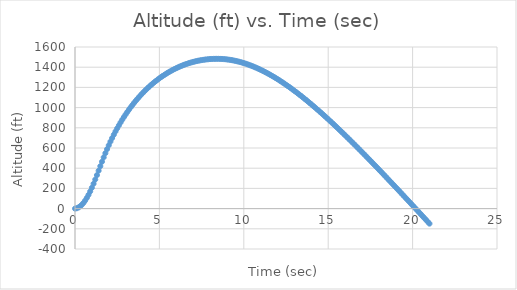
| Category | Series 0 |
|---|---|
| 0.0 | 0 |
| 0.1 | 3.427 |
| 0.2 | 10.56 |
| 0.30000000000000004 | 21.672 |
| 0.4 | 36.799 |
| 0.5 | 55.93 |
| 0.6 | 79.007 |
| 0.7 | 105.843 |
| 0.7999999999999999 | 136.231 |
| 0.8999999999999999 | 169.945 |
| 0.9999999999999999 | 206.744 |
| 1.0999999999999999 | 246.239 |
| 1.2 | 288.037 |
| 1.3 | 331.465 |
| 1.4000000000000001 | 375.577 |
| 1.5000000000000002 | 420.05 |
| 1.6000000000000003 | 464.271 |
| 1.7000000000000004 | 507.351 |
| 1.8000000000000005 | 548.898 |
| 1.9000000000000006 | 588.853 |
| 2.0000000000000004 | 627.005 |
| 2.1000000000000005 | 663.486 |
| 2.2000000000000006 | 698.412 |
| 2.3000000000000007 | 731.887 |
| 2.400000000000001 | 764.004 |
| 2.500000000000001 | 794.847 |
| 2.600000000000001 | 824.489 |
| 2.700000000000001 | 852.998 |
| 2.800000000000001 | 880.437 |
| 2.9000000000000012 | 906.859 |
| 3.0000000000000013 | 932.317 |
| 3.1000000000000014 | 956.856 |
| 3.2000000000000015 | 980.52 |
| 3.3000000000000016 | 1003.346 |
| 3.4000000000000017 | 1025.372 |
| 3.5000000000000018 | 1046.63 |
| 3.600000000000002 | 1067.151 |
| 3.700000000000002 | 1086.963 |
| 3.800000000000002 | 1106.093 |
| 3.900000000000002 | 1124.566 |
| 4.000000000000002 | 1142.403 |
| 4.100000000000001 | 1159.627 |
| 4.200000000000001 | 1176.257 |
| 4.300000000000001 | 1192.311 |
| 4.4 | 1207.807 |
| 4.5 | 1222.761 |
| 4.6 | 1237.188 |
| 4.699999999999999 | 1251.102 |
| 4.799999999999999 | 1264.517 |
| 4.899999999999999 | 1277.445 |
| 4.999999999999998 | 1289.898 |
| 5.099999999999998 | 1301.887 |
| 5.1999999999999975 | 1313.422 |
| 5.299999999999997 | 1324.513 |
| 5.399999999999997 | 1335.169 |
| 5.4999999999999964 | 1345.4 |
| 5.599999999999996 | 1355.213 |
| 5.699999999999996 | 1364.615 |
| 5.799999999999995 | 1373.615 |
| 5.899999999999995 | 1382.219 |
| 5.999999999999995 | 1390.433 |
| 6.099999999999994 | 1398.263 |
| 6.199999999999994 | 1405.716 |
| 6.299999999999994 | 1412.797 |
| 6.399999999999993 | 1419.51 |
| 6.499999999999993 | 1425.861 |
| 6.5999999999999925 | 1431.854 |
| 6.699999999999992 | 1437.494 |
| 6.799999999999992 | 1442.784 |
| 6.8999999999999915 | 1447.729 |
| 6.999999999999991 | 1452.332 |
| 7.099999999999991 | 1456.598 |
| 7.19999999999999 | 1460.529 |
| 7.29999999999999 | 1464.129 |
| 7.39999999999999 | 1467.402 |
| 7.499999999999989 | 1470.351 |
| 7.599999999999989 | 1472.981 |
| 7.699999999999989 | 1475.295 |
| 7.799999999999988 | 1477.298 |
| 7.899999999999988 | 1478.993 |
| 7.999999999999988 | 1480.386 |
| 8.099999999999987 | 1481.479 |
| 8.199999999999987 | 1482.274 |
| 8.299999999999986 | 1482.768 |
| 8.399999999999986 | 1482.953 |
| 8.499999999999986 | 1482.816 |
| 8.599999999999985 | 1482.345 |
| 8.699999999999985 | 1481.53 |
| 8.799999999999985 | 1480.367 |
| 8.899999999999984 | 1478.858 |
| 8.999999999999984 | 1477.006 |
| 9.099999999999984 | 1474.816 |
| 9.199999999999983 | 1472.293 |
| 9.299999999999983 | 1469.441 |
| 9.399999999999983 | 1466.266 |
| 9.499999999999982 | 1462.77 |
| 9.599999999999982 | 1458.958 |
| 9.699999999999982 | 1454.833 |
| 9.799999999999981 | 1450.397 |
| 9.89999999999998 | 1445.655 |
| 9.99999999999998 | 1440.609 |
| 10.09999999999998 | 1435.263 |
| 10.19999999999998 | 1429.619 |
| 10.29999999999998 | 1423.682 |
| 10.399999999999979 | 1417.453 |
| 10.499999999999979 | 1410.938 |
| 10.599999999999978 | 1404.139 |
| 10.699999999999978 | 1397.059 |
| 10.799999999999978 | 1389.703 |
| 10.899999999999977 | 1382.074 |
| 10.999999999999977 | 1374.176 |
| 11.099999999999977 | 1366.013 |
| 11.199999999999976 | 1357.588 |
| 11.299999999999976 | 1348.906 |
| 11.399999999999975 | 1339.971 |
| 11.499999999999975 | 1330.786 |
| 11.599999999999975 | 1321.357 |
| 11.699999999999974 | 1311.686 |
| 11.799999999999974 | 1301.778 |
| 11.899999999999974 | 1291.638 |
| 11.999999999999973 | 1281.27 |
| 12.099999999999973 | 1270.677 |
| 12.199999999999973 | 1259.865 |
| 12.299999999999972 | 1248.837 |
| 12.399999999999972 | 1237.598 |
| 12.499999999999972 | 1226.152 |
| 12.599999999999971 | 1214.503 |
| 12.69999999999997 | 1202.656 |
| 12.79999999999997 | 1190.614 |
| 12.89999999999997 | 1178.383 |
| 12.99999999999997 | 1165.966 |
| 13.09999999999997 | 1153.368 |
| 13.199999999999969 | 1140.592 |
| 13.299999999999969 | 1127.643 |
| 13.399999999999968 | 1114.525 |
| 13.499999999999968 | 1101.241 |
| 13.599999999999968 | 1087.797 |
| 13.699999999999967 | 1074.195 |
| 13.799999999999967 | 1060.441 |
| 13.899999999999967 | 1046.537 |
| 13.999999999999966 | 1032.487 |
| 14.099999999999966 | 1018.296 |
| 14.199999999999966 | 1003.966 |
| 14.299999999999965 | 989.502 |
| 14.399999999999965 | 974.907 |
| 14.499999999999964 | 960.185 |
| 14.599999999999964 | 945.339 |
| 14.699999999999964 | 930.373 |
| 14.799999999999963 | 915.29 |
| 14.899999999999963 | 900.092 |
| 14.999999999999963 | 884.785 |
| 15.099999999999962 | 869.369 |
| 15.199999999999962 | 853.85 |
| 15.299999999999962 | 838.229 |
| 15.399999999999961 | 822.51 |
| 15.499999999999961 | 806.695 |
| 15.59999999999996 | 790.788 |
| 15.69999999999996 | 774.792 |
| 15.79999999999996 | 758.708 |
| 15.89999999999996 | 742.539 |
| 15.99999999999996 | 726.289 |
| 16.09999999999996 | 709.96 |
| 16.19999999999996 | 693.554 |
| 16.29999999999996 | 677.073 |
| 16.399999999999963 | 660.521 |
| 16.499999999999964 | 643.898 |
| 16.599999999999966 | 627.208 |
| 16.699999999999967 | 610.453 |
| 16.79999999999997 | 593.635 |
| 16.89999999999997 | 576.755 |
| 16.99999999999997 | 559.817 |
| 17.099999999999973 | 542.821 |
| 17.199999999999974 | 525.77 |
| 17.299999999999976 | 508.665 |
| 17.399999999999977 | 491.509 |
| 17.49999999999998 | 474.304 |
| 17.59999999999998 | 457.05 |
| 17.69999999999998 | 439.749 |
| 17.799999999999983 | 422.404 |
| 17.899999999999984 | 405.015 |
| 17.999999999999986 | 387.585 |
| 18.099999999999987 | 370.114 |
| 18.19999999999999 | 352.604 |
| 18.29999999999999 | 335.057 |
| 18.39999999999999 | 317.474 |
| 18.499999999999993 | 299.856 |
| 18.599999999999994 | 282.204 |
| 18.699999999999996 | 264.521 |
| 18.799999999999997 | 246.806 |
| 18.9 | 229.061 |
| 19.0 | 211.287 |
| 19.1 | 193.486 |
| 19.200000000000003 | 175.657 |
| 19.300000000000004 | 157.804 |
| 19.400000000000006 | 139.925 |
| 19.500000000000007 | 122.023 |
| 19.60000000000001 | 104.098 |
| 19.70000000000001 | 86.152 |
| 19.80000000000001 | 68.184 |
| 19.900000000000013 | 50.196 |
| 20.000000000000014 | 32.189 |
| 20.100000000000016 | 14.164 |
| 20.200000000000017 | -3.88 |
| 20.30000000000002 | -21.94 |
| 20.40000000000002 | -40.016 |
| 20.50000000000002 | -58.108 |
| 20.600000000000023 | -76.215 |
| 20.700000000000024 | -94.337 |
| 20.800000000000026 | -112.471 |
| 20.900000000000027 | -130.619 |
| 21.00000000000003 | -148.779 |